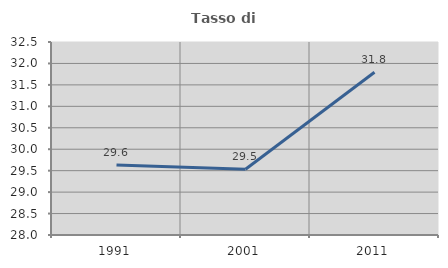
| Category | Tasso di occupazione   |
|---|---|
| 1991.0 | 29.634 |
| 2001.0 | 29.532 |
| 2011.0 | 31.795 |